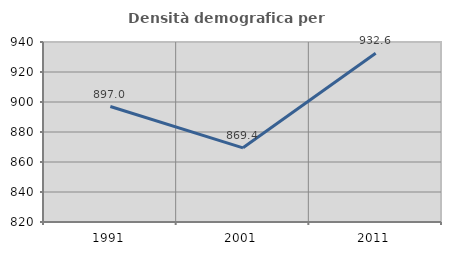
| Category | Densità demografica |
|---|---|
| 1991.0 | 896.988 |
| 2001.0 | 869.445 |
| 2011.0 | 932.552 |